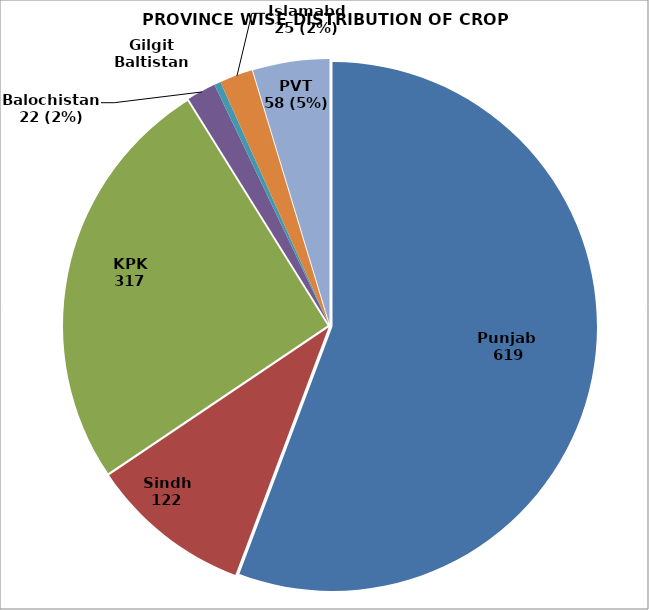
| Category | Series 0 |
|---|---|
| Punjab | 691 |
| Sindh | 122 |
| KPK | 317 |
| Balochistan | 22 |
| Gilgit Baltistan | 5 |
| Islamabd | 25 |
| PVT | 58 |